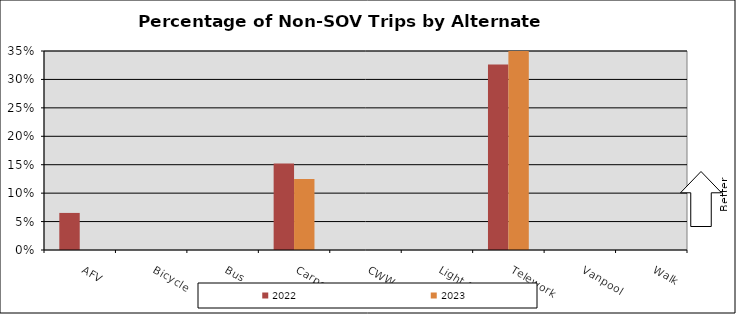
| Category | 2022 | 2023 |
|---|---|---|
| AFV | 0.065 | 0 |
| Bicycle | 0 | 0 |
| Bus | 0 | 0 |
| Carpool | 0.152 | 0.125 |
| CWW | 0 | 0 |
| Light Rail | 0 | 0 |
| Telework | 0.326 | 0.479 |
| Vanpool | 0 | 0 |
| Walk | 0 | 0 |